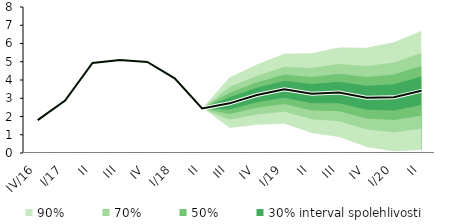
| Category | linka | Centerline |
|---|---|---|
| IV/16 | 1.804 | 1.804 |
| I/17 | 2.871 | 2.871 |
| II | 4.931 | 4.931 |
| III | 5.1 | 5.1 |
| IV | 4.988 | 4.988 |
| I/18 | 4.092 | 4.092 |
| II | 2.439 | 2.439 |
| III | 2.721 | 2.721 |
| IV | 3.176 | 3.176 |
| I/19 | 3.491 | 3.491 |
| II | 3.25 | 3.25 |
| III | 3.309 | 3.309 |
| IV | 3.026 | 3.026 |
| I/20 | 3.051 | 3.051 |
| II | 3.406 | 3.406 |